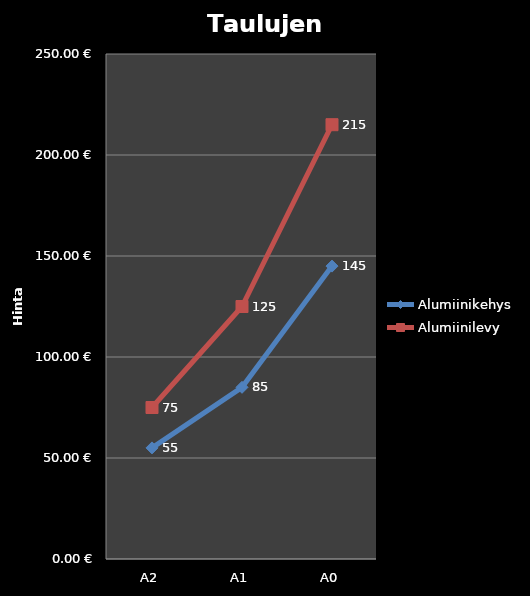
| Category | Alumiinikehys | Alumiinilevy |
|---|---|---|
| 0 | 55 | 75 |
| 1 | 85 | 125 |
| 2 | 145 | 215 |